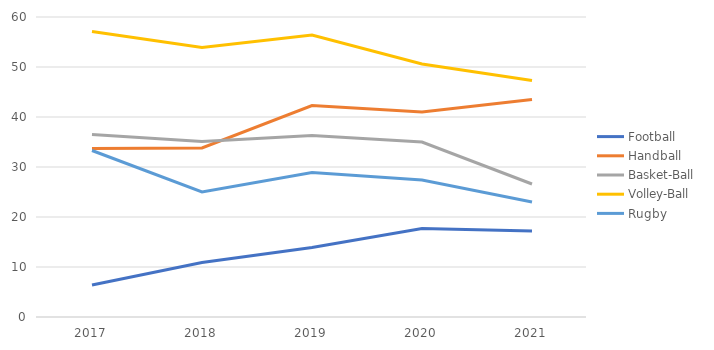
| Category | Football | Handball | Basket-Ball | Volley-Ball | Rugby |
|---|---|---|---|---|---|
| 2017.0 | 6.4 | 33.7 | 36.5 | 57.1 | 33.3 |
| 2018.0 | 10.9 | 33.8 | 35.1 | 53.9 | 25 |
| 2019.0 | 13.9 | 42.3 | 36.3 | 56.4 | 28.9 |
| 2020.0 | 17.7 | 41 | 35 | 50.6 | 27.4 |
| 2021.0 | 17.2 | 43.5 | 26.6 | 47.3 | 23 |